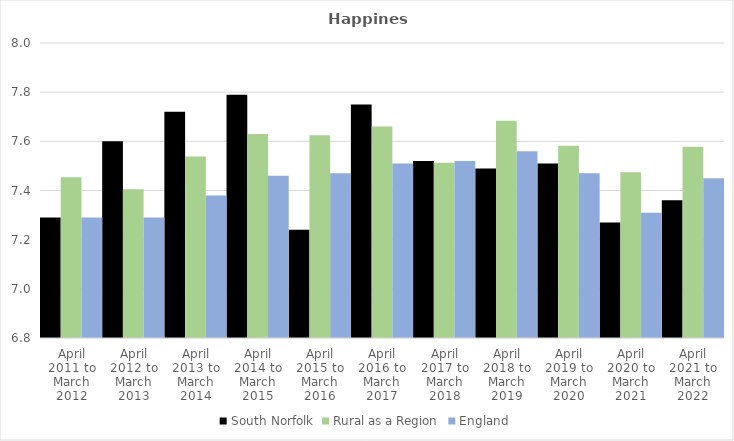
| Category | South Norfolk | Rural as a Region | England |
|---|---|---|---|
| April 2011 to March 2012 | 7.29 | 7.454 | 7.29 |
| April 2012 to March 2013 | 7.6 | 7.406 | 7.29 |
| April 2013 to March 2014 | 7.72 | 7.539 | 7.38 |
| April 2014 to March 2015 | 7.79 | 7.63 | 7.46 |
| April 2015 to March 2016 | 7.24 | 7.625 | 7.47 |
| April 2016 to March 2017 | 7.75 | 7.661 | 7.51 |
| April 2017 to March 2018 | 7.52 | 7.513 | 7.52 |
| April 2018 to March 2019 | 7.49 | 7.684 | 7.56 |
| April 2019 to March 2020 | 7.51 | 7.582 | 7.47 |
| April 2020 to March 2021 | 7.27 | 7.474 | 7.31 |
| April 2021 to March 2022 | 7.36 | 7.577 | 7.45 |